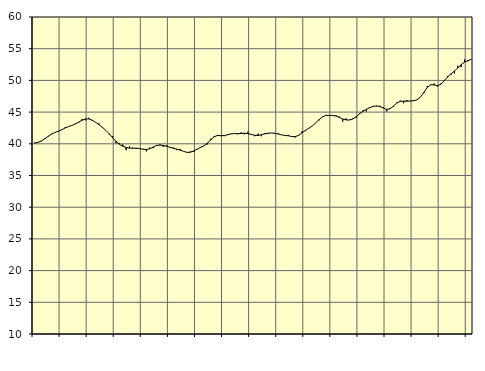
| Category | Piggar | Samtliga fast anställda (inkl. fast anställda utomlands) |
|---|---|---|
| nan | 40.2 | 40.09 |
| 87.0 | 40.2 | 40.24 |
| 87.0 | 40.4 | 40.46 |
| 87.0 | 40.9 | 40.79 |
| nan | 41.1 | 41.19 |
| 88.0 | 41.6 | 41.53 |
| 88.0 | 41.8 | 41.78 |
| 88.0 | 41.9 | 41.99 |
| nan | 42.2 | 42.23 |
| 89.0 | 42.6 | 42.49 |
| 89.0 | 42.7 | 42.73 |
| 89.0 | 42.9 | 42.9 |
| nan | 43.2 | 43.13 |
| 90.0 | 43.3 | 43.42 |
| 90.0 | 43.9 | 43.71 |
| 90.0 | 43.7 | 43.92 |
| nan | 44.1 | 43.93 |
| 91.0 | 43.6 | 43.72 |
| 91.0 | 43.4 | 43.39 |
| 91.0 | 43.2 | 43.02 |
| nan | 42.5 | 42.6 |
| 92.0 | 42.1 | 42.12 |
| 92.0 | 41.5 | 41.59 |
| 92.0 | 41.2 | 40.98 |
| nan | 40.1 | 40.39 |
| 93.0 | 40.1 | 39.93 |
| 93.0 | 39.9 | 39.62 |
| 93.0 | 39 | 39.43 |
| nan | 39.6 | 39.32 |
| 94.0 | 39.4 | 39.3 |
| 94.0 | 39.2 | 39.31 |
| 94.0 | 39.3 | 39.25 |
| nan | 39.2 | 39.14 |
| 95.0 | 38.8 | 39.1 |
| 95.0 | 39.4 | 39.21 |
| 95.0 | 39.3 | 39.49 |
| nan | 39.8 | 39.73 |
| 96.0 | 39.9 | 39.8 |
| 96.0 | 39.5 | 39.74 |
| 96.0 | 39.8 | 39.6 |
| nan | 39.4 | 39.45 |
| 97.0 | 39.4 | 39.28 |
| 97.0 | 39 | 39.15 |
| 97.0 | 39.2 | 39 |
| nan | 38.8 | 38.81 |
| 98.0 | 38.7 | 38.65 |
| 98.0 | 38.8 | 38.67 |
| 98.0 | 38.7 | 38.87 |
| nan | 39.1 | 39.16 |
| 99.0 | 39.5 | 39.43 |
| 99.0 | 39.7 | 39.68 |
| 99.0 | 39.9 | 40.08 |
| nan | 40.8 | 40.62 |
| 0.0 | 41.2 | 41.11 |
| 0.0 | 41.4 | 41.31 |
| 0.0 | 41.2 | 41.29 |
| nan | 41.2 | 41.3 |
| 1.0 | 41.5 | 41.42 |
| 1.0 | 41.6 | 41.57 |
| 1.0 | 41.6 | 41.61 |
| nan | 41.5 | 41.6 |
| 2.0 | 41.8 | 41.63 |
| 2.0 | 41.5 | 41.67 |
| 2.0 | 41.9 | 41.61 |
| nan | 41.4 | 41.47 |
| 3.0 | 41.2 | 41.34 |
| 3.0 | 41.6 | 41.31 |
| 3.0 | 41.2 | 41.43 |
| nan | 41.7 | 41.58 |
| 4.0 | 41.6 | 41.68 |
| 4.0 | 41.7 | 41.7 |
| 4.0 | 41.6 | 41.65 |
| nan | 41.7 | 41.54 |
| 5.0 | 41.4 | 41.4 |
| 5.0 | 41.3 | 41.32 |
| 5.0 | 41.4 | 41.26 |
| nan | 41.1 | 41.14 |
| 6.0 | 41 | 41.12 |
| 6.0 | 41.3 | 41.35 |
| 6.0 | 42 | 41.74 |
| nan | 42 | 42.12 |
| 7.0 | 42.5 | 42.45 |
| 7.0 | 42.8 | 42.81 |
| 7.0 | 43.3 | 43.28 |
| nan | 43.7 | 43.81 |
| 8.0 | 44.3 | 44.25 |
| 8.0 | 44.4 | 44.46 |
| 8.0 | 44.5 | 44.48 |
| nan | 44.4 | 44.47 |
| 9.0 | 44.5 | 44.38 |
| 9.0 | 44.3 | 44.17 |
| 9.0 | 43.5 | 43.91 |
| nan | 44 | 43.76 |
| 10.0 | 43.8 | 43.75 |
| 10.0 | 44 | 43.91 |
| 10.0 | 44.1 | 44.26 |
| nan | 44.8 | 44.73 |
| 11.0 | 45.3 | 45.13 |
| 11.0 | 45.1 | 45.45 |
| 11.0 | 45.8 | 45.7 |
| nan | 45.8 | 45.9 |
| 12.0 | 45.9 | 45.98 |
| 12.0 | 46 | 45.88 |
| 12.0 | 45.8 | 45.65 |
| nan | 45.1 | 45.43 |
| 13.0 | 45.6 | 45.52 |
| 13.0 | 45.8 | 45.96 |
| 13.0 | 46.5 | 46.43 |
| nan | 46.8 | 46.69 |
| 14.0 | 46.4 | 46.73 |
| 14.0 | 46.9 | 46.73 |
| 14.0 | 46.7 | 46.75 |
| nan | 46.9 | 46.8 |
| 15.0 | 46.9 | 46.95 |
| 15.0 | 47.4 | 47.39 |
| 15.0 | 48 | 48.12 |
| nan | 49.1 | 48.91 |
| 16.0 | 49.4 | 49.31 |
| 16.0 | 49.5 | 49.29 |
| 16.0 | 49 | 49.18 |
| nan | 49.5 | 49.39 |
| 17.0 | 49.9 | 49.95 |
| 17.0 | 50.7 | 50.55 |
| 17.0 | 50.9 | 51.03 |
| nan | 51.1 | 51.47 |
| 18.0 | 52.3 | 51.96 |
| 18.0 | 52.1 | 52.49 |
| 18.0 | 53.3 | 52.88 |
| nan | 53 | 53.13 |
| 19.0 | 53.3 | 53.32 |